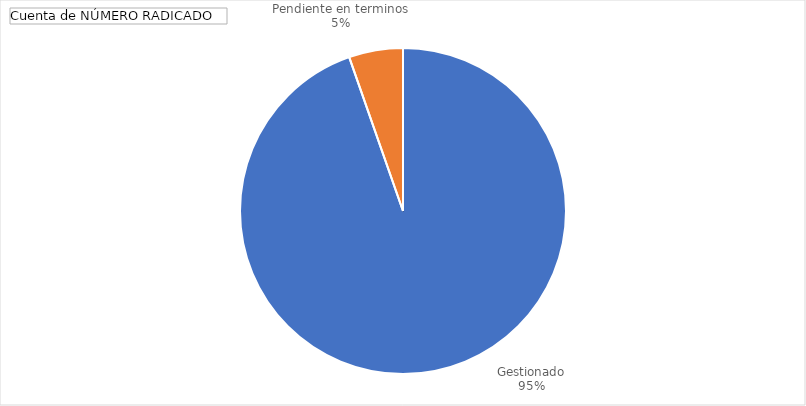
| Category | Total |
|---|---|
| Gestionado | 265 |
| Pendiente en terminos | 15 |